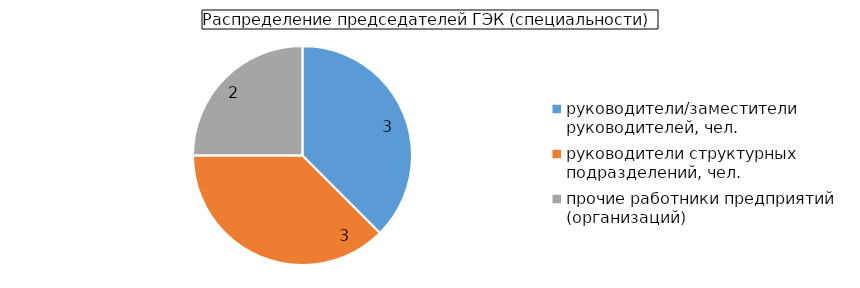
| Category | Series 1 |
|---|---|
| руководители/заместители руководителей, чел. | 3 |
| руководители структурных подразделений, чел. | 3 |
| прочие работники предприятий (организаций) | 2 |